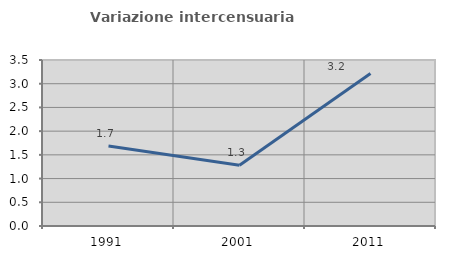
| Category | Variazione intercensuaria annua |
|---|---|
| 1991.0 | 1.689 |
| 2001.0 | 1.283 |
| 2011.0 | 3.215 |